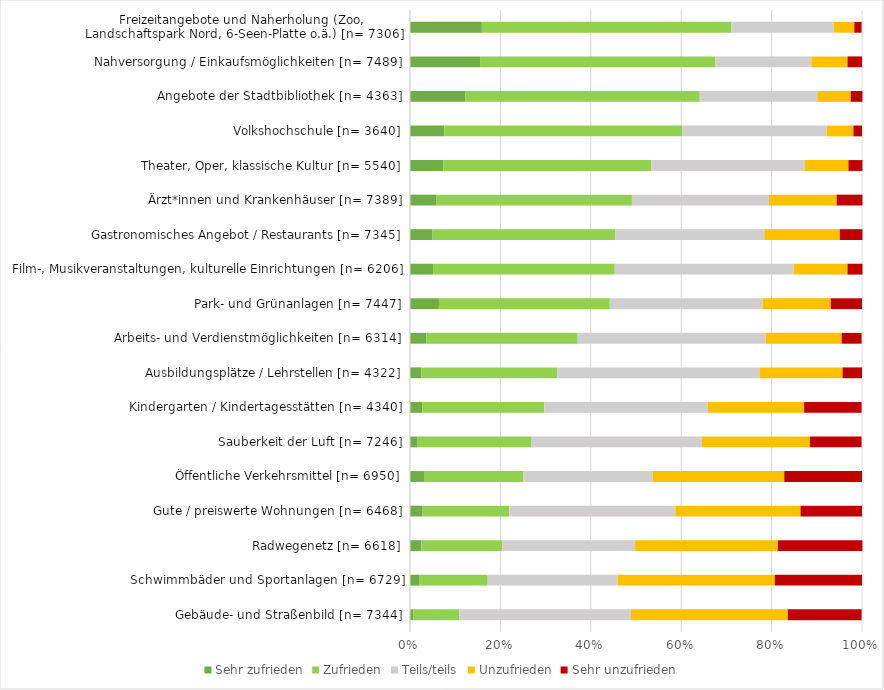
| Category | Sehr zufrieden | Zufrieden | Teils/teils | Unzufrieden | Sehr unzufrieden |
|---|---|---|---|---|---|
| Gebäude- und Straßenbild [n= 7344] | 0.007 | 0.102 | 0.38 | 0.347 | 0.163 |
| Schwimmbäder und Sportanlagen [n= 6729] | 0.02 | 0.152 | 0.287 | 0.348 | 0.193 |
| Radwegenetz [n= 6618] | 0.025 | 0.179 | 0.294 | 0.316 | 0.187 |
| Gute / preiswerte Wohnungen [n= 6468] | 0.028 | 0.192 | 0.367 | 0.277 | 0.136 |
| Öffentliche Verkehrsmittel [n= 6950] | 0.031 | 0.22 | 0.286 | 0.291 | 0.172 |
| Sauberkeit der Luft [n= 7246] | 0.017 | 0.252 | 0.377 | 0.239 | 0.114 |
| Kindergarten / Kindertagesstätten [n= 4340] | 0.027 | 0.27 | 0.362 | 0.213 | 0.127 |
| Ausbildungsplätze / Lehrstellen [n= 4322] | 0.025 | 0.301 | 0.447 | 0.184 | 0.043 |
| Arbeits- und Verdienstmöglichkeiten [n= 6314] | 0.036 | 0.335 | 0.416 | 0.168 | 0.044 |
| Park- und Grünanlagen [n= 7447] | 0.064 | 0.378 | 0.338 | 0.151 | 0.069 |
| Film-, Musikveranstaltungen, kulturelle Einrichtungen [n= 6206] | 0.051 | 0.402 | 0.396 | 0.119 | 0.033 |
| Gastronomisches Angebot / Restaurants [n= 7345] | 0.05 | 0.404 | 0.33 | 0.167 | 0.05 |
| Ärzt*innen und Krankenhäuser [n= 7389] | 0.059 | 0.432 | 0.303 | 0.15 | 0.057 |
| Theater, Oper, klassische Kultur [n= 5540] | 0.074 | 0.46 | 0.34 | 0.096 | 0.031 |
| Volkshochschule [n= 3640] | 0.076 | 0.527 | 0.319 | 0.059 | 0.019 |
| Angebote der Stadtbibliothek [n= 4363] | 0.122 | 0.519 | 0.26 | 0.074 | 0.026 |
| Nahversorgung / Einkaufsmöglichkeiten [n= 7489] | 0.155 | 0.521 | 0.212 | 0.08 | 0.032 |
| Freizeitangebote und Naherholung (Zoo, 
Landschaftspark Nord, 6-Seen-Platte o.ä.) [n= 7306] | 0.159 | 0.552 | 0.227 | 0.045 | 0.016 |